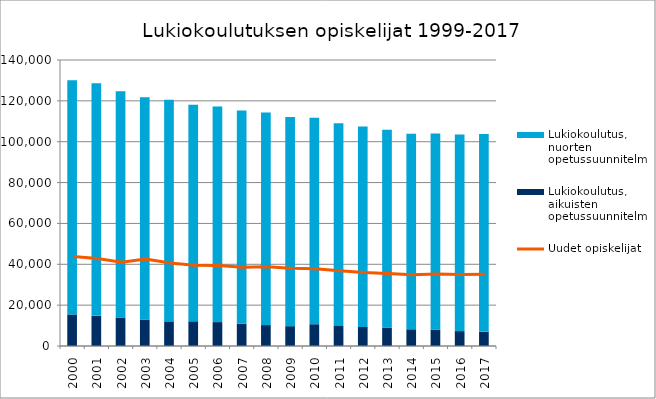
| Category | Lukiokoulutus, aikuisten opetussuunnitelma | Lukiokoulutus, nuorten opetussuunnitelma |
|---|---|---|
| 2000.0 | 15445 | 114587 |
| 2001.0 | 14755 | 113887 |
| 2002.0 | 13951 | 110693 |
| 2003.0 | 12892 | 108924 |
| 2004.0 | 12068 | 108463 |
| 2005.0 | 12091 | 106020 |
| 2006.0 | 11688 | 105572 |
| 2007.0 | 10885 | 104368 |
| 2008.0 | 10230 | 104010 |
| 2009.0 | 9713 | 102375 |
| 2010.0 | 10661 | 101117 |
| 2011.0 | 9778 | 99268 |
| 2012.0 | 9357 | 98055 |
| 2013.0 | 9043 | 96855 |
| 2014.0 | 8182 | 95732 |
| 2015.0 | 8066 | 95994 |
| 2016.0 | 7282 | 96268 |
| 2017.0 | 6915 | 96838 |